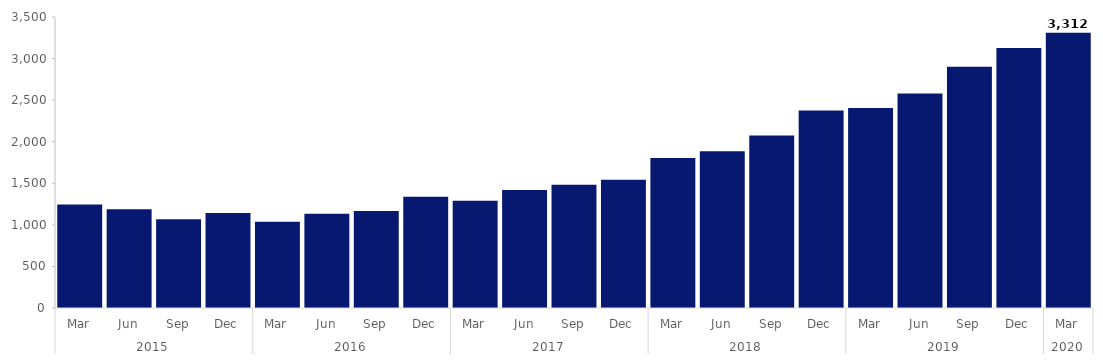
| Category | Series 0 |
|---|---|
| 0 | 1246 |
| 1 | 1189 |
| 2 | 1068 |
| 3 | 1143 |
| 4 | 1036 |
| 5 | 1135 |
| 6 | 1168 |
| 7 | 1339 |
| 8 | 1289 |
| 9 | 1420 |
| 10 | 1483 |
| 11 | 1543 |
| 12 | 1805 |
| 13 | 1885 |
| 14 | 2076 |
| 15 | 2374 |
| 16 | 2407 |
| 17 | 2580 |
| 18 | 2901 |
| 19 | 3126 |
| 20 | 3312 |